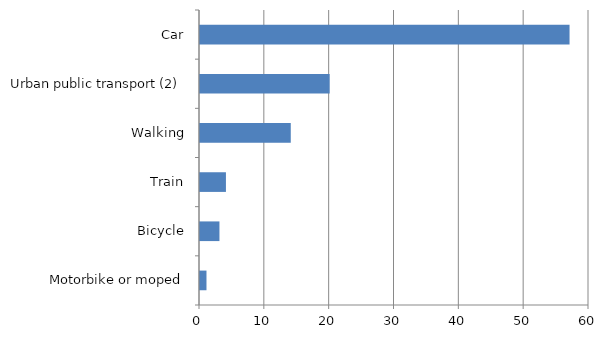
| Category | Series 0 |
|---|---|
| Motorbike or moped | 1 |
| Bicycle | 3 |
| Train | 4 |
| Walking | 14 |
| Urban public transport (2) | 20 |
| Car | 57 |